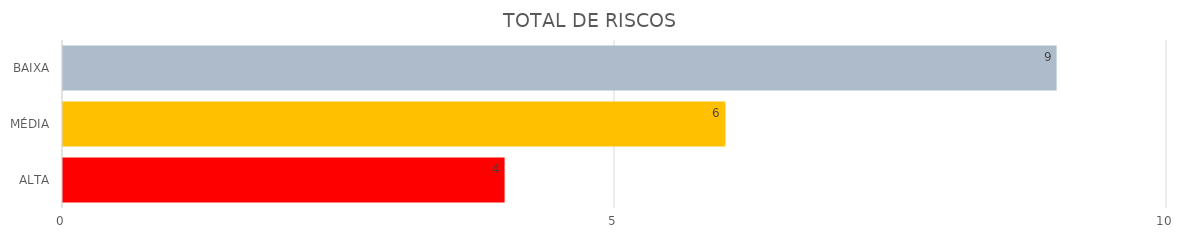
| Category | Series 1 | Series 0 |
|---|---|---|
| ALTA | 4 | 4 |
| MÉDIA | 6 | 6 |
| BAIXA | 9 | 9 |